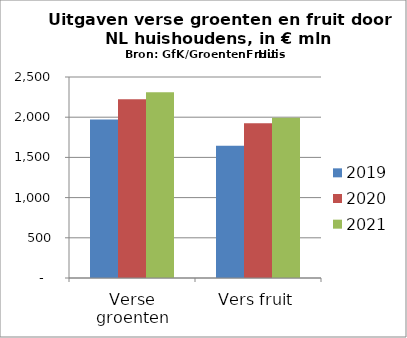
| Category | 2019 | 2020 | 2021 |
|---|---|---|---|
| Verse groenten | 1971 | 2224 | 2311.45 |
| Vers fruit | 1645 | 1924 | 1994.7 |